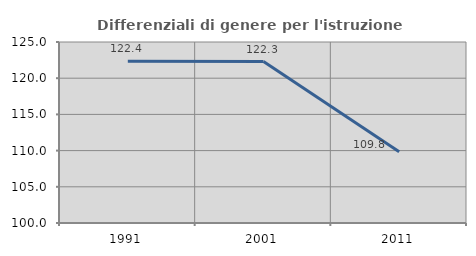
| Category | Differenziali di genere per l'istruzione superiore |
|---|---|
| 1991.0 | 122.356 |
| 2001.0 | 122.294 |
| 2011.0 | 109.846 |